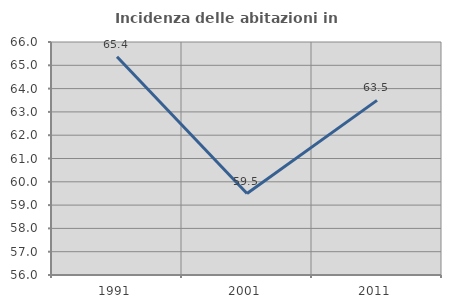
| Category | Incidenza delle abitazioni in proprietà  |
|---|---|
| 1991.0 | 65.367 |
| 2001.0 | 59.497 |
| 2011.0 | 63.495 |